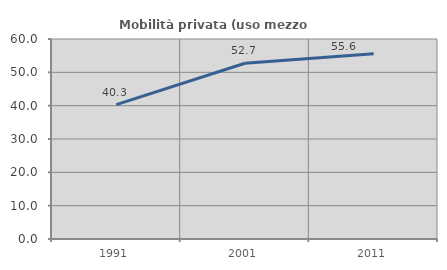
| Category | Mobilità privata (uso mezzo privato) |
|---|---|
| 1991.0 | 40.32 |
| 2001.0 | 52.735 |
| 2011.0 | 55.556 |